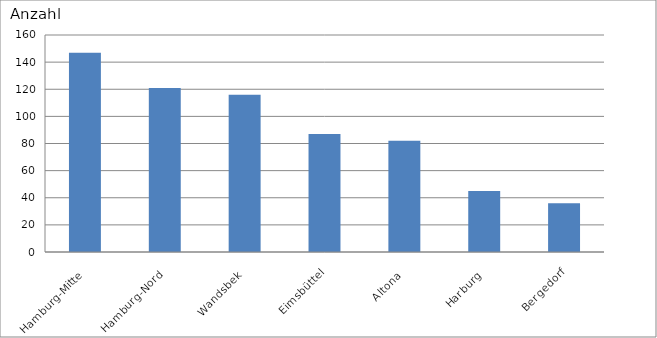
| Category | Hamburg-Mitte |
|---|---|
| Hamburg-Mitte | 147 |
| Hamburg-Nord | 121 |
| Wandsbek | 116 |
| Eimsbüttel | 87 |
| Altona | 82 |
| Harburg | 45 |
| Bergedorf | 36 |